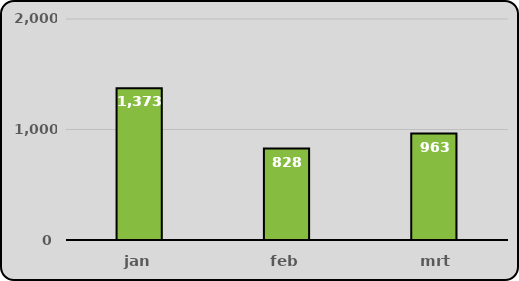
| Category | Totaal |
|---|---|
| jan | 1373 |
| feb | 828 |
| mrt | 963 |